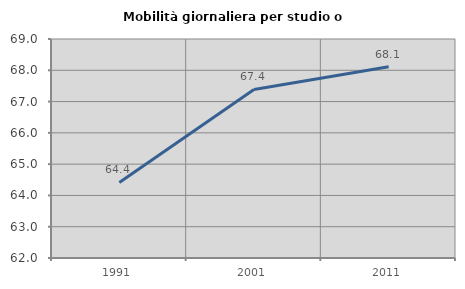
| Category | Mobilità giornaliera per studio o lavoro |
|---|---|
| 1991.0 | 64.415 |
| 2001.0 | 67.387 |
| 2011.0 | 68.115 |